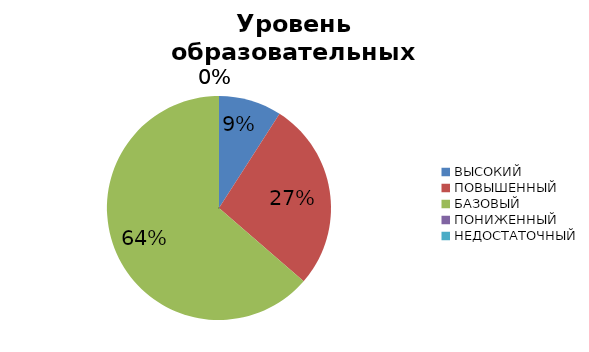
| Category | Series 0 |
|---|---|
| ВЫСОКИЙ | 9.091 |
| ПОВЫШЕННЫЙ | 27.273 |
| БАЗОВЫЙ | 63.636 |
| ПОНИЖЕННЫЙ | 0 |
| НЕДОСТАТОЧНЫЙ | 0 |